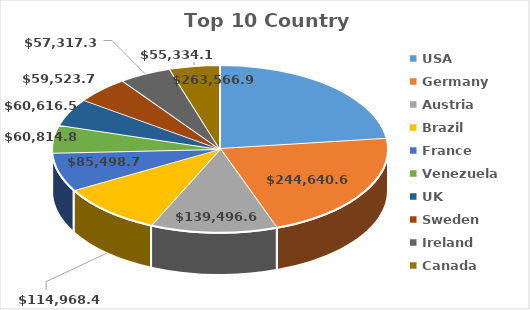
| Category | Total |
|---|---|
| USA | 263566.98 |
| Germany | 244640.63 |
| Austria | 139496.63 |
| Brazil | 114968.48 |
| France | 85498.76 |
| Venezuela | 60814.89 |
| UK | 60616.51 |
| Sweden | 59523.7 |
| Ireland | 57317.39 |
| Canada | 55334.1 |